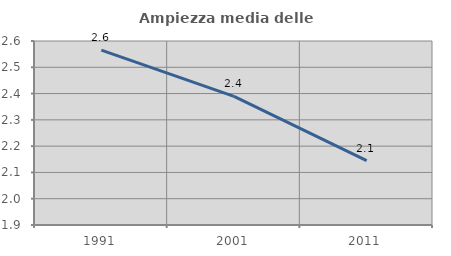
| Category | Ampiezza media delle famiglie |
|---|---|
| 1991.0 | 2.566 |
| 2001.0 | 2.39 |
| 2011.0 | 2.145 |